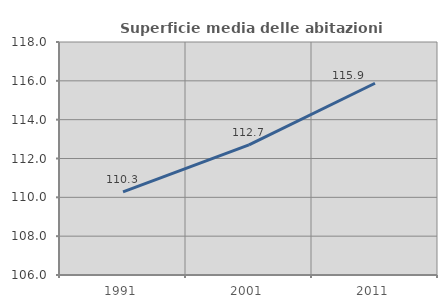
| Category | Superficie media delle abitazioni occupate |
|---|---|
| 1991.0 | 110.28 |
| 2001.0 | 112.699 |
| 2011.0 | 115.874 |